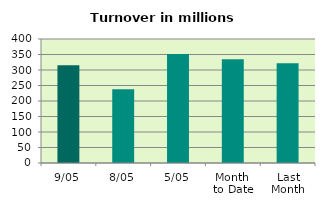
| Category | Series 0 |
|---|---|
| 9/05 | 315.65 |
| 8/05 | 237.892 |
| 5/05 | 351.658 |
| Month 
to Date | 334.623 |
| Last
Month | 322.024 |